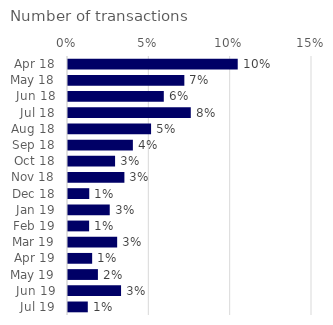
| Category | Number of transactions |
|---|---|
| Apr 18 | 0.104 |
| May 18 | 0.072 |
| Jun 18 | 0.059 |
| Jul 18 | 0.075 |
| Aug 18 | 0.051 |
| Sep 18 | 0.04 |
| Oct 18 | 0.029 |
| Nov 18 | 0.035 |
| Dec 18 | 0.013 |
| Jan 19 | 0.026 |
| Feb 19 | 0.013 |
| Mar 19 | 0.03 |
| Apr 19 | 0.015 |
| May 19 | 0.018 |
| Jun 19 | 0.033 |
| Jul 19 | 0.012 |